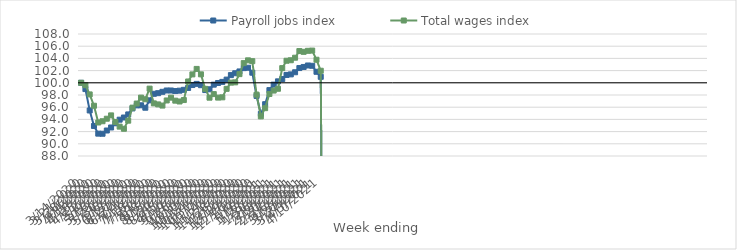
| Category | Payroll jobs index | Total wages index |
|---|---|---|
| 14/03/2020 | 100 | 100 |
| 21/03/2020 | 98.969 | 99.607 |
| 28/03/2020 | 95.465 | 98.096 |
| 04/04/2020 | 92.926 | 96.24 |
| 11/04/2020 | 91.665 | 93.491 |
| 18/04/2020 | 91.648 | 93.698 |
| 25/04/2020 | 92.178 | 94.112 |
| 02/05/2020 | 92.676 | 94.658 |
| 09/05/2020 | 93.362 | 93.579 |
| 16/05/2020 | 93.954 | 92.815 |
| 23/05/2020 | 94.309 | 92.466 |
| 30/05/2020 | 94.816 | 93.79 |
| 06/06/2020 | 95.798 | 95.927 |
| 13/06/2020 | 96.298 | 96.601 |
| 20/06/2020 | 96.313 | 97.572 |
| 27/06/2020 | 95.913 | 97.302 |
| 04/07/2020 | 97.122 | 99.043 |
| 11/07/2020 | 98.196 | 96.625 |
| 18/07/2020 | 98.298 | 96.459 |
| 25/07/2020 | 98.521 | 96.266 |
| 01/08/2020 | 98.741 | 97.104 |
| 08/08/2020 | 98.74 | 97.565 |
| 15/08/2020 | 98.647 | 97.073 |
| 22/08/2020 | 98.71 | 96.935 |
| 29/08/2020 | 98.849 | 97.171 |
| 05/09/2020 | 99.156 | 100.217 |
| 12/09/2020 | 99.633 | 101.376 |
| 19/09/2020 | 99.824 | 102.277 |
| 26/09/2020 | 99.608 | 101.388 |
| 03/10/2020 | 98.809 | 99.006 |
| 10/10/2020 | 98.937 | 97.561 |
| 17/10/2020 | 99.695 | 98.146 |
| 24/10/2020 | 99.968 | 97.574 |
| 31/10/2020 | 100.149 | 97.618 |
| 07/11/2020 | 100.524 | 99.008 |
| 14/11/2020 | 101.259 | 100.027 |
| 21/11/2020 | 101.568 | 100.07 |
| 28/11/2020 | 101.862 | 101.42 |
| 05/12/2020 | 102.408 | 103.225 |
| 12/12/2020 | 102.467 | 103.683 |
| 19/12/2020 | 101.656 | 103.548 |
| 26/12/2020 | 97.85 | 98.062 |
| 02/01/2021 | 94.918 | 94.494 |
| 09/01/2021 | 96.496 | 95.843 |
| 16/01/2021 | 98.804 | 98.169 |
| 23/01/2021 | 99.699 | 98.726 |
| 30/01/2021 | 100.239 | 99.021 |
| 06/02/2021 | 100.616 | 102.406 |
| 13/02/2021 | 101.287 | 103.616 |
| 20/02/2021 | 101.379 | 103.698 |
| 27/02/2021 | 101.729 | 104.114 |
| 06/03/2021 | 102.416 | 105.202 |
| 13/03/2021 | 102.596 | 105.075 |
| 20/03/2021 | 102.84 | 105.243 |
| 27/03/2021 | 102.789 | 105.282 |
| 03/04/2021 | 101.804 | 103.78 |
| 10/04/2021 | 100.982 | 101.976 |